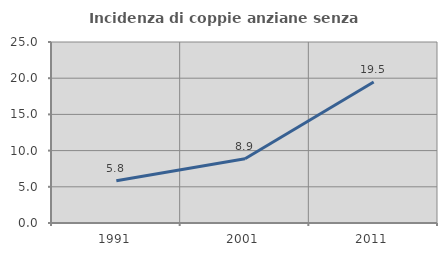
| Category | Incidenza di coppie anziane senza figli  |
|---|---|
| 1991.0 | 5.833 |
| 2001.0 | 8.871 |
| 2011.0 | 19.469 |